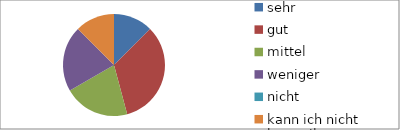
| Category | Series 0 |
|---|---|
| sehr | 3 |
| gut | 8 |
| mittel | 5 |
| weniger | 5 |
| nicht | 0 |
| kann ich nicht beurteilen | 3 |
| keine Angabe | 0 |